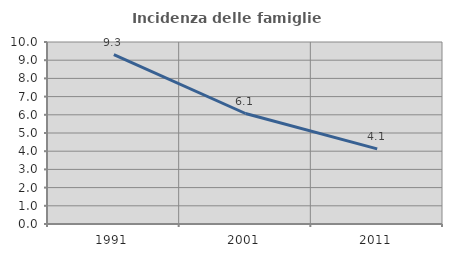
| Category | Incidenza delle famiglie numerose |
|---|---|
| 1991.0 | 9.312 |
| 2001.0 | 6.071 |
| 2011.0 | 4.127 |